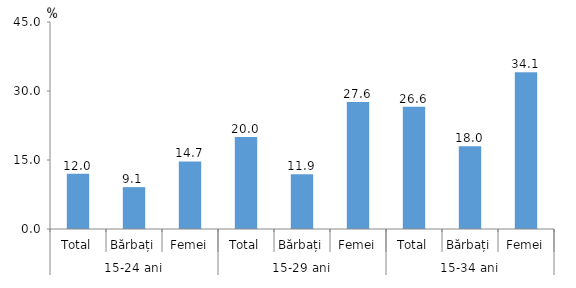
| Category | Series 0 |
|---|---|
| 0 | 12 |
| 1 | 9.1 |
| 2 | 14.7 |
| 3 | 20 |
| 4 | 11.9 |
| 5 | 27.6 |
| 6 | 26.6 |
| 7 | 18 |
| 8 | 34.1 |